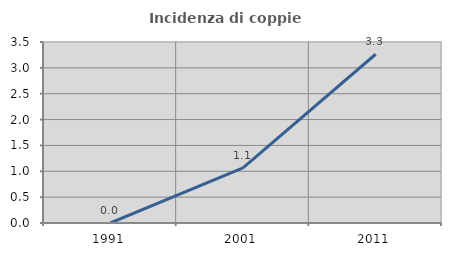
| Category | Incidenza di coppie miste |
|---|---|
| 1991.0 | 0 |
| 2001.0 | 1.064 |
| 2011.0 | 3.263 |